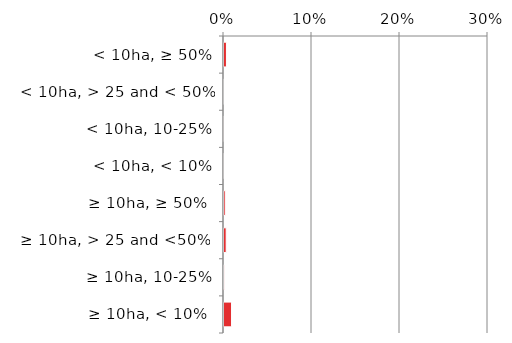
| Category | Near native & fragments |
|---|---|
|  ≥ 10ha, < 10%  | 0.01 |
|   ≥ 10ha, 10-25% | 0.001 |
|   ≥ 10ha, > 25 and <50%  | 0.004 |
|   ≥ 10ha, ≥ 50%  | 0.003 |
|  < 10ha, < 10% | 0 |
|  < 10ha, 10-25% | 0 |
|  < 10ha, > 25 and < 50% | 0.001 |
|  < 10ha, ≥ 50% | 0.004 |